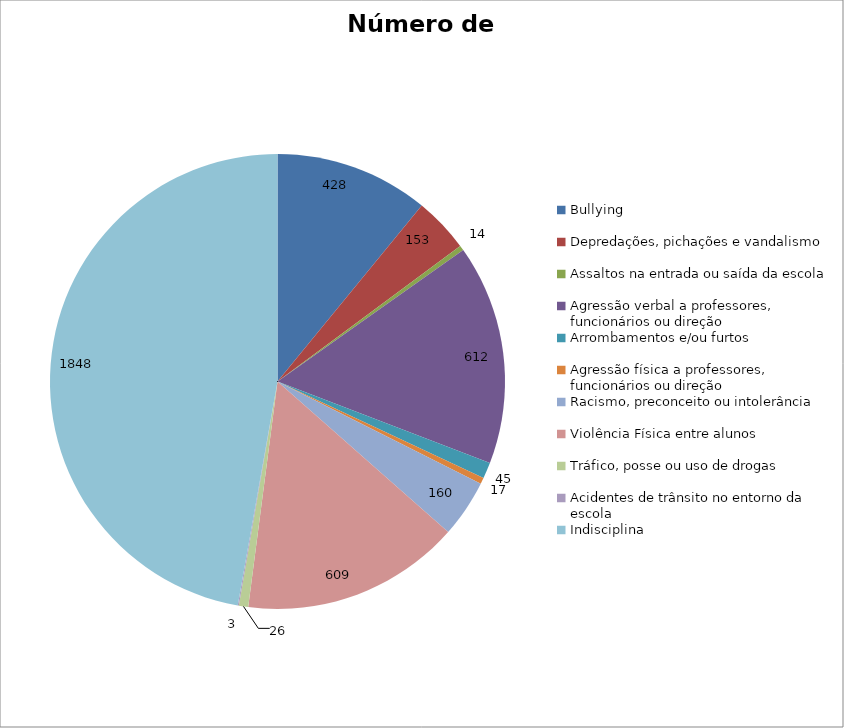
| Category | Número de Casos |
|---|---|
| Bullying | 428 |
| Depredações, pichações e vandalismo | 153 |
| Assaltos na entrada ou saída da escola | 14 |
| Agressão verbal a professores, funcionários ou direção | 612 |
| Arrombamentos e/ou furtos | 45 |
| Agressão física a professores, funcionários ou direção | 17 |
| Racismo, preconceito ou intolerância | 160 |
| Violência Física entre alunos | 609 |
| Tráfico, posse ou uso de drogas | 26 |
| Acidentes de trânsito no entorno da escola | 3 |
| Indisciplina | 1848 |